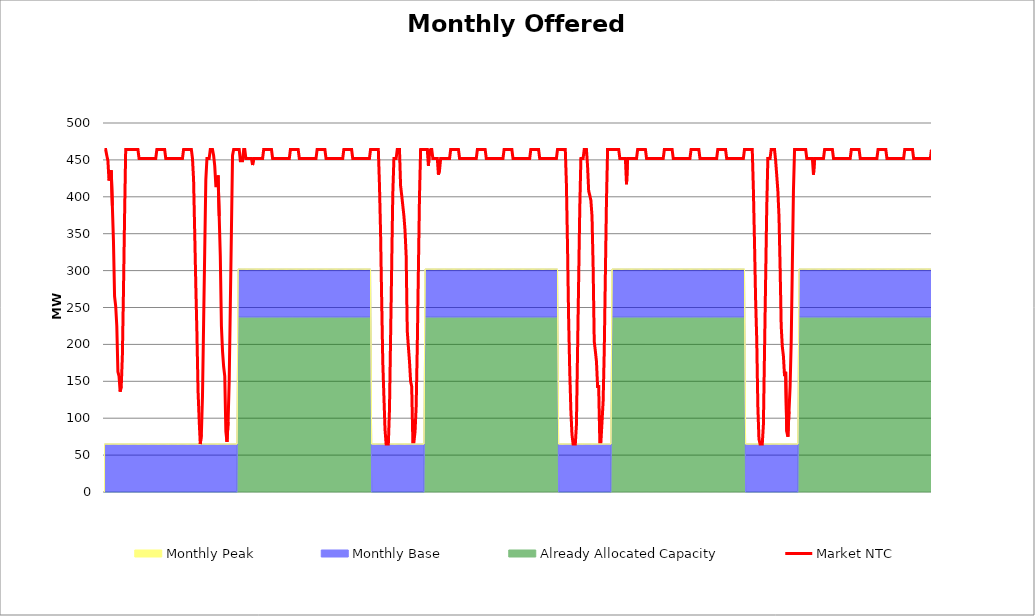
| Category | Market NTC |
|---|---|
| 0 | 464 |
| 1 | 464 |
| 2 | 456 |
| 3 | 449 |
| 4 | 422 |
| 5 | 429 |
| 6 | 436 |
| 7 | 388 |
| 8 | 340 |
| 9 | 265 |
| 10 | 252 |
| 11 | 225 |
| 12 | 163 |
| 13 | 157 |
| 14 | 136 |
| 15 | 143 |
| 16 | 184 |
| 17 | 272 |
| 18 | 374 |
| 19 | 464 |
| 20 | 464 |
| 21 | 464 |
| 22 | 464 |
| 23 | 464 |
| 24 | 464 |
| 25 | 464 |
| 26 | 464 |
| 27 | 464 |
| 28 | 464 |
| 29 | 464 |
| 30 | 464 |
| 31 | 452 |
| 32 | 452 |
| 33 | 452 |
| 34 | 452 |
| 35 | 452 |
| 36 | 452 |
| 37 | 452 |
| 38 | 452 |
| 39 | 452 |
| 40 | 452 |
| 41 | 452 |
| 42 | 452 |
| 43 | 452 |
| 44 | 452 |
| 45 | 452 |
| 46 | 452 |
| 47 | 464 |
| 48 | 464 |
| 49 | 464 |
| 50 | 464 |
| 51 | 464 |
| 52 | 464 |
| 53 | 464 |
| 54 | 464 |
| 55 | 452 |
| 56 | 452 |
| 57 | 452 |
| 58 | 452 |
| 59 | 452 |
| 60 | 452 |
| 61 | 452 |
| 62 | 452 |
| 63 | 452 |
| 64 | 452 |
| 65 | 452 |
| 66 | 452 |
| 67 | 452 |
| 68 | 452 |
| 69 | 452 |
| 70 | 452 |
| 71 | 464 |
| 72 | 464 |
| 73 | 464 |
| 74 | 464 |
| 75 | 464 |
| 76 | 464 |
| 77 | 464 |
| 78 | 464 |
| 79 | 452 |
| 80 | 423 |
| 81 | 352 |
| 82 | 280 |
| 83 | 215 |
| 84 | 137 |
| 85 | 98 |
| 86 | 65 |
| 87 | 78 |
| 88 | 130 |
| 89 | 228 |
| 90 | 326 |
| 91 | 423 |
| 92 | 452 |
| 93 | 452 |
| 94 | 452 |
| 95 | 464 |
| 96 | 464 |
| 97 | 464 |
| 98 | 456 |
| 99 | 442 |
| 100 | 415 |
| 101 | 415 |
| 102 | 429 |
| 103 | 374 |
| 104 | 320 |
| 105 | 225 |
| 106 | 191 |
| 107 | 170 |
| 108 | 157 |
| 109 | 82 |
| 110 | 68 |
| 111 | 95 |
| 112 | 150 |
| 113 | 252 |
| 114 | 354 |
| 115 | 456 |
| 116 | 464 |
| 117 | 464 |
| 118 | 464 |
| 119 | 464 |
| 120 | 464 |
| 121 | 464 |
| 122 | 449 |
| 123 | 449 |
| 124 | 449 |
| 125 | 464 |
| 126 | 464 |
| 127 | 452 |
| 128 | 452 |
| 129 | 452 |
| 130 | 452 |
| 131 | 452 |
| 132 | 452 |
| 133 | 443 |
| 134 | 452 |
| 135 | 452 |
| 136 | 452 |
| 137 | 452 |
| 138 | 452 |
| 139 | 452 |
| 140 | 452 |
| 141 | 452 |
| 142 | 452 |
| 143 | 464 |
| 144 | 464 |
| 145 | 464 |
| 146 | 464 |
| 147 | 464 |
| 148 | 464 |
| 149 | 464 |
| 150 | 464 |
| 151 | 452 |
| 152 | 452 |
| 153 | 452 |
| 154 | 452 |
| 155 | 452 |
| 156 | 452 |
| 157 | 452 |
| 158 | 452 |
| 159 | 452 |
| 160 | 452 |
| 161 | 452 |
| 162 | 452 |
| 163 | 452 |
| 164 | 452 |
| 165 | 452 |
| 166 | 452 |
| 167 | 464 |
| 168 | 464 |
| 169 | 464 |
| 170 | 464 |
| 171 | 464 |
| 172 | 464 |
| 173 | 464 |
| 174 | 464 |
| 175 | 452 |
| 176 | 452 |
| 177 | 452 |
| 178 | 452 |
| 179 | 452 |
| 180 | 452 |
| 181 | 452 |
| 182 | 452 |
| 183 | 452 |
| 184 | 452 |
| 185 | 452 |
| 186 | 452 |
| 187 | 452 |
| 188 | 452 |
| 189 | 452 |
| 190 | 452 |
| 191 | 464 |
| 192 | 464 |
| 193 | 464 |
| 194 | 464 |
| 195 | 464 |
| 196 | 464 |
| 197 | 464 |
| 198 | 464 |
| 199 | 452 |
| 200 | 452 |
| 201 | 452 |
| 202 | 452 |
| 203 | 452 |
| 204 | 452 |
| 205 | 452 |
| 206 | 452 |
| 207 | 452 |
| 208 | 452 |
| 209 | 452 |
| 210 | 452 |
| 211 | 452 |
| 212 | 452 |
| 213 | 452 |
| 214 | 452 |
| 215 | 464 |
| 216 | 464 |
| 217 | 464 |
| 218 | 464 |
| 219 | 464 |
| 220 | 464 |
| 221 | 464 |
| 222 | 464 |
| 223 | 452 |
| 224 | 452 |
| 225 | 452 |
| 226 | 452 |
| 227 | 452 |
| 228 | 452 |
| 229 | 452 |
| 230 | 452 |
| 231 | 452 |
| 232 | 452 |
| 233 | 452 |
| 234 | 452 |
| 235 | 452 |
| 236 | 452 |
| 237 | 452 |
| 238 | 452 |
| 239 | 464 |
| 240 | 464 |
| 241 | 464 |
| 242 | 464 |
| 243 | 464 |
| 244 | 464 |
| 245 | 464 |
| 246 | 464 |
| 247 | 417 |
| 248 | 352 |
| 249 | 261 |
| 250 | 176 |
| 251 | 130 |
| 252 | 85 |
| 253 | 65 |
| 254 | 65 |
| 255 | 65 |
| 256 | 111 |
| 257 | 208 |
| 258 | 306 |
| 259 | 404 |
| 260 | 452 |
| 261 | 452 |
| 262 | 452 |
| 263 | 464 |
| 264 | 464 |
| 265 | 464 |
| 266 | 415 |
| 267 | 402 |
| 268 | 388 |
| 269 | 374 |
| 270 | 354 |
| 271 | 320 |
| 272 | 218 |
| 273 | 197 |
| 274 | 177 |
| 275 | 150 |
| 276 | 143 |
| 277 | 68 |
| 278 | 68 |
| 279 | 82 |
| 280 | 116 |
| 281 | 197 |
| 282 | 300 |
| 283 | 402 |
| 284 | 464 |
| 285 | 464 |
| 286 | 464 |
| 287 | 464 |
| 288 | 464 |
| 289 | 464 |
| 290 | 464 |
| 291 | 442 |
| 292 | 463 |
| 293 | 464 |
| 294 | 464 |
| 295 | 452 |
| 296 | 452 |
| 297 | 452 |
| 298 | 452 |
| 299 | 452 |
| 300 | 430 |
| 301 | 436 |
| 302 | 452 |
| 303 | 452 |
| 304 | 452 |
| 305 | 452 |
| 306 | 452 |
| 307 | 452 |
| 308 | 452 |
| 309 | 452 |
| 310 | 452 |
| 311 | 464 |
| 312 | 464 |
| 313 | 464 |
| 314 | 464 |
| 315 | 464 |
| 316 | 464 |
| 317 | 464 |
| 318 | 464 |
| 319 | 452 |
| 320 | 452 |
| 321 | 452 |
| 322 | 452 |
| 323 | 452 |
| 324 | 452 |
| 325 | 452 |
| 326 | 452 |
| 327 | 452 |
| 328 | 452 |
| 329 | 452 |
| 330 | 452 |
| 331 | 452 |
| 332 | 452 |
| 333 | 452 |
| 334 | 452 |
| 335 | 464 |
| 336 | 464 |
| 337 | 464 |
| 338 | 464 |
| 339 | 464 |
| 340 | 464 |
| 341 | 464 |
| 342 | 464 |
| 343 | 452 |
| 344 | 452 |
| 345 | 452 |
| 346 | 452 |
| 347 | 452 |
| 348 | 452 |
| 349 | 452 |
| 350 | 452 |
| 351 | 452 |
| 352 | 452 |
| 353 | 452 |
| 354 | 452 |
| 355 | 452 |
| 356 | 452 |
| 357 | 452 |
| 358 | 452 |
| 359 | 464 |
| 360 | 464 |
| 361 | 464 |
| 362 | 464 |
| 363 | 464 |
| 364 | 464 |
| 365 | 464 |
| 366 | 464 |
| 367 | 452 |
| 368 | 452 |
| 369 | 452 |
| 370 | 452 |
| 371 | 452 |
| 372 | 452 |
| 373 | 452 |
| 374 | 452 |
| 375 | 452 |
| 376 | 452 |
| 377 | 452 |
| 378 | 452 |
| 379 | 452 |
| 380 | 452 |
| 381 | 452 |
| 382 | 452 |
| 383 | 464 |
| 384 | 464 |
| 385 | 464 |
| 386 | 464 |
| 387 | 464 |
| 388 | 464 |
| 389 | 464 |
| 390 | 464 |
| 391 | 452 |
| 392 | 452 |
| 393 | 452 |
| 394 | 452 |
| 395 | 452 |
| 396 | 452 |
| 397 | 452 |
| 398 | 452 |
| 399 | 452 |
| 400 | 452 |
| 401 | 452 |
| 402 | 452 |
| 403 | 452 |
| 404 | 452 |
| 405 | 452 |
| 406 | 452 |
| 407 | 464 |
| 408 | 464 |
| 409 | 464 |
| 410 | 464 |
| 411 | 464 |
| 412 | 464 |
| 413 | 464 |
| 414 | 464 |
| 415 | 417 |
| 416 | 332 |
| 417 | 234 |
| 418 | 163 |
| 419 | 111 |
| 420 | 78 |
| 421 | 65 |
| 422 | 65 |
| 423 | 65 |
| 424 | 91 |
| 425 | 189 |
| 426 | 287 |
| 427 | 384 |
| 428 | 452 |
| 429 | 452 |
| 430 | 452 |
| 431 | 464 |
| 432 | 464 |
| 433 | 464 |
| 434 | 442 |
| 435 | 408 |
| 436 | 402 |
| 437 | 395 |
| 438 | 374 |
| 439 | 306 |
| 440 | 204 |
| 441 | 191 |
| 442 | 177 |
| 443 | 143 |
| 444 | 143 |
| 445 | 68 |
| 446 | 68 |
| 447 | 95 |
| 448 | 123 |
| 449 | 191 |
| 450 | 293 |
| 451 | 395 |
| 452 | 464 |
| 453 | 464 |
| 454 | 464 |
| 455 | 464 |
| 456 | 464 |
| 457 | 464 |
| 458 | 464 |
| 459 | 464 |
| 460 | 464 |
| 461 | 464 |
| 462 | 464 |
| 463 | 452 |
| 464 | 452 |
| 465 | 452 |
| 466 | 452 |
| 467 | 452 |
| 468 | 452 |
| 469 | 417 |
| 470 | 452 |
| 471 | 452 |
| 472 | 452 |
| 473 | 452 |
| 474 | 452 |
| 475 | 452 |
| 476 | 452 |
| 477 | 452 |
| 478 | 452 |
| 479 | 464 |
| 480 | 464 |
| 481 | 464 |
| 482 | 464 |
| 483 | 464 |
| 484 | 464 |
| 485 | 464 |
| 486 | 464 |
| 487 | 452 |
| 488 | 452 |
| 489 | 452 |
| 490 | 452 |
| 491 | 452 |
| 492 | 452 |
| 493 | 452 |
| 494 | 452 |
| 495 | 452 |
| 496 | 452 |
| 497 | 452 |
| 498 | 452 |
| 499 | 452 |
| 500 | 452 |
| 501 | 452 |
| 502 | 452 |
| 503 | 464 |
| 504 | 464 |
| 505 | 464 |
| 506 | 464 |
| 507 | 464 |
| 508 | 464 |
| 509 | 464 |
| 510 | 464 |
| 511 | 452 |
| 512 | 452 |
| 513 | 452 |
| 514 | 452 |
| 515 | 452 |
| 516 | 452 |
| 517 | 452 |
| 518 | 452 |
| 519 | 452 |
| 520 | 452 |
| 521 | 452 |
| 522 | 452 |
| 523 | 452 |
| 524 | 452 |
| 525 | 452 |
| 526 | 452 |
| 527 | 464 |
| 528 | 464 |
| 529 | 464 |
| 530 | 464 |
| 531 | 464 |
| 532 | 464 |
| 533 | 464 |
| 534 | 464 |
| 535 | 452 |
| 536 | 452 |
| 537 | 452 |
| 538 | 452 |
| 539 | 452 |
| 540 | 452 |
| 541 | 452 |
| 542 | 452 |
| 543 | 452 |
| 544 | 452 |
| 545 | 452 |
| 546 | 452 |
| 547 | 452 |
| 548 | 452 |
| 549 | 452 |
| 550 | 452 |
| 551 | 464 |
| 552 | 464 |
| 553 | 464 |
| 554 | 464 |
| 555 | 464 |
| 556 | 464 |
| 557 | 464 |
| 558 | 464 |
| 559 | 452 |
| 560 | 452 |
| 561 | 452 |
| 562 | 452 |
| 563 | 452 |
| 564 | 452 |
| 565 | 452 |
| 566 | 452 |
| 567 | 452 |
| 568 | 452 |
| 569 | 452 |
| 570 | 452 |
| 571 | 452 |
| 572 | 452 |
| 573 | 452 |
| 574 | 452 |
| 575 | 464 |
| 576 | 464 |
| 577 | 464 |
| 578 | 464 |
| 579 | 464 |
| 580 | 464 |
| 581 | 464 |
| 582 | 464 |
| 583 | 410 |
| 584 | 339 |
| 585 | 261 |
| 586 | 208 |
| 587 | 117 |
| 588 | 72 |
| 589 | 65 |
| 590 | 65 |
| 591 | 65 |
| 592 | 91 |
| 593 | 189 |
| 594 | 287 |
| 595 | 384 |
| 596 | 452 |
| 597 | 452 |
| 598 | 452 |
| 599 | 464 |
| 600 | 464 |
| 601 | 464 |
| 602 | 464 |
| 603 | 449 |
| 604 | 429 |
| 605 | 408 |
| 606 | 374 |
| 607 | 306 |
| 608 | 225 |
| 609 | 197 |
| 610 | 184 |
| 611 | 157 |
| 612 | 163 |
| 613 | 82 |
| 614 | 75 |
| 615 | 109 |
| 616 | 143 |
| 617 | 204 |
| 618 | 306 |
| 619 | 408 |
| 620 | 464 |
| 621 | 464 |
| 622 | 464 |
| 623 | 464 |
| 624 | 464 |
| 625 | 464 |
| 626 | 464 |
| 627 | 464 |
| 628 | 464 |
| 629 | 464 |
| 630 | 464 |
| 631 | 452 |
| 632 | 452 |
| 633 | 452 |
| 634 | 452 |
| 635 | 452 |
| 636 | 452 |
| 637 | 430 |
| 638 | 452 |
| 639 | 452 |
| 640 | 452 |
| 641 | 452 |
| 642 | 452 |
| 643 | 452 |
| 644 | 452 |
| 645 | 452 |
| 646 | 452 |
| 647 | 464 |
| 648 | 464 |
| 649 | 464 |
| 650 | 464 |
| 651 | 464 |
| 652 | 464 |
| 653 | 464 |
| 654 | 464 |
| 655 | 452 |
| 656 | 452 |
| 657 | 452 |
| 658 | 452 |
| 659 | 452 |
| 660 | 452 |
| 661 | 452 |
| 662 | 452 |
| 663 | 452 |
| 664 | 452 |
| 665 | 452 |
| 666 | 452 |
| 667 | 452 |
| 668 | 452 |
| 669 | 452 |
| 670 | 452 |
| 671 | 464 |
| 672 | 464 |
| 673 | 464 |
| 674 | 464 |
| 675 | 464 |
| 676 | 464 |
| 677 | 464 |
| 678 | 464 |
| 679 | 452 |
| 680 | 452 |
| 681 | 452 |
| 682 | 452 |
| 683 | 452 |
| 684 | 452 |
| 685 | 452 |
| 686 | 452 |
| 687 | 452 |
| 688 | 452 |
| 689 | 452 |
| 690 | 452 |
| 691 | 452 |
| 692 | 452 |
| 693 | 452 |
| 694 | 452 |
| 695 | 464 |
| 696 | 464 |
| 697 | 464 |
| 698 | 464 |
| 699 | 464 |
| 700 | 464 |
| 701 | 464 |
| 702 | 464 |
| 703 | 452 |
| 704 | 452 |
| 705 | 452 |
| 706 | 452 |
| 707 | 452 |
| 708 | 452 |
| 709 | 452 |
| 710 | 452 |
| 711 | 452 |
| 712 | 452 |
| 713 | 452 |
| 714 | 452 |
| 715 | 452 |
| 716 | 452 |
| 717 | 452 |
| 718 | 452 |
| 719 | 464 |
| 720 | 464 |
| 721 | 464 |
| 722 | 464 |
| 723 | 464 |
| 724 | 464 |
| 725 | 464 |
| 726 | 464 |
| 727 | 452 |
| 728 | 452 |
| 729 | 452 |
| 730 | 452 |
| 731 | 452 |
| 732 | 452 |
| 733 | 452 |
| 734 | 452 |
| 735 | 452 |
| 736 | 452 |
| 737 | 452 |
| 738 | 452 |
| 739 | 452 |
| 740 | 452 |
| 741 | 452 |
| 742 | 452 |
| 743 | 464 |